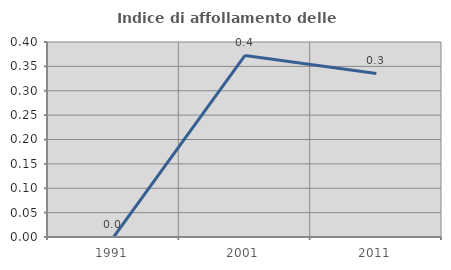
| Category | Indice di affollamento delle abitazioni  |
|---|---|
| 1991.0 | 0 |
| 2001.0 | 0.372 |
| 2011.0 | 0.336 |